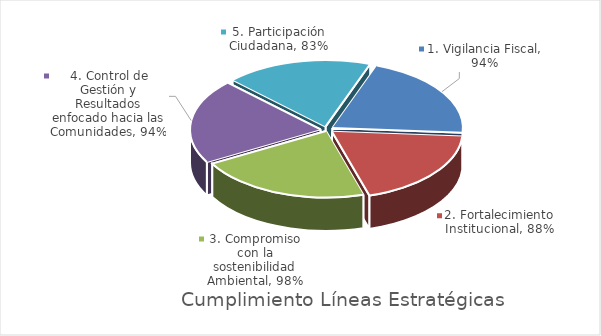
| Category | Series 0 | porcentaje |
|---|---|---|
| 1. Vigilancia Fiscal | 0.94 |  |
| 2. Fortalecimiento Institucional | 0.88 |  |
| 3. Compromiso con la sostenibilidad Ambiental | 0.98 |  |
| 4. Control de Gestión y Resultados enfocado hacia las Comunidades | 0.94 |  |
| 5. Participación Ciudadana | 0.83 |  |